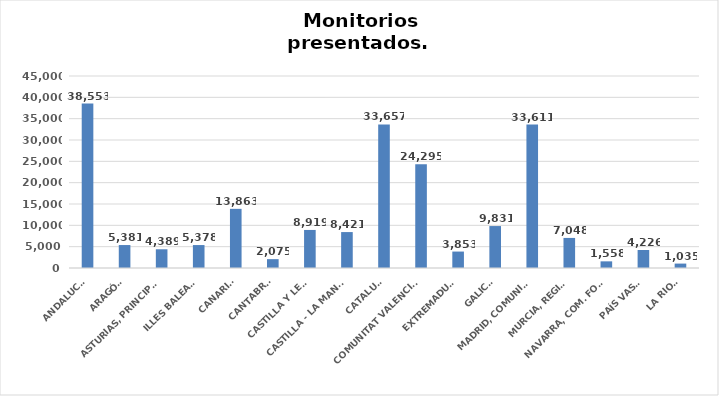
| Category | Series 0 |
|---|---|
| ANDALUCÍA | 38553 |
| ARAGÓN | 5381 |
| ASTURIAS, PRINCIPADO | 4389 |
| ILLES BALEARS | 5378 |
| CANARIAS | 13863 |
| CANTABRIA | 2075 |
| CASTILLA Y LEÓN | 8919 |
| CASTILLA - LA MANCHA | 8421 |
| CATALUÑA | 33657 |
| COMUNITAT VALENCIANA | 24295 |
| EXTREMADURA | 3853 |
| GALICIA | 9831 |
| MADRID, COMUNIDAD | 33611 |
| MURCIA, REGIÓN | 7048 |
| NAVARRA, COM. FORAL | 1558 |
| PAÍS VASCO | 4226 |
| LA RIOJA | 1035 |